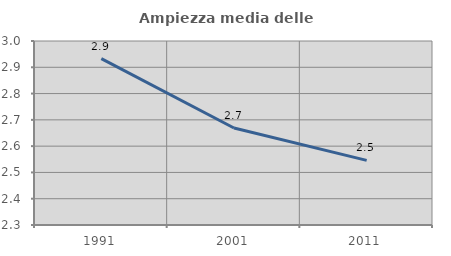
| Category | Ampiezza media delle famiglie |
|---|---|
| 1991.0 | 2.933 |
| 2001.0 | 2.669 |
| 2011.0 | 2.546 |